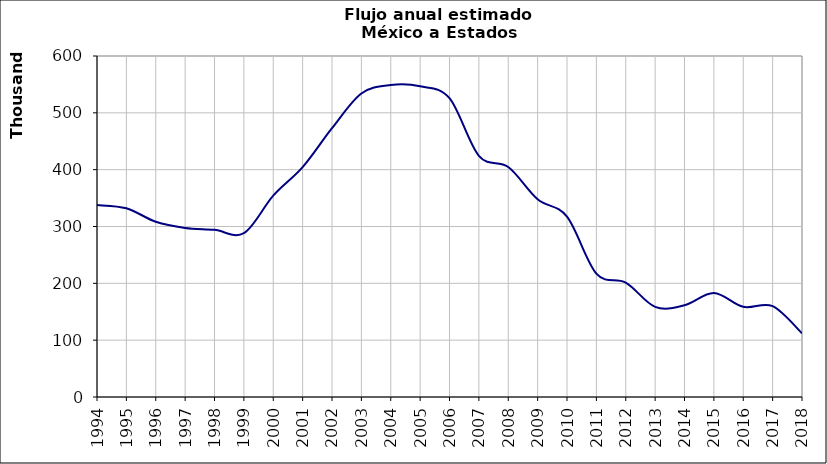
| Category | Flujo anual |
|---|---|
| 1994.0 | 337796.16 |
| 1995.0 | 332085.154 |
| 1996.0 | 308363.04 |
| 1997.0 | 297545.453 |
| 1998.0 | 294086.72 |
| 1999.0 | 288229.093 |
| 2000.0 | 354257.76 |
| 2001.0 | 404343.886 |
| 2002.0 | 472895.686 |
| 2003.0 | 534095.429 |
| 2004.0 | 548921.44 |
| 2005.0 | 546659.394 |
| 2006.0 | 525788.352 |
| 2007.0 | 424291.716 |
| 2008.0 | 404718.752 |
| 2009.0 | 348062.857 |
| 2010.0 | 317214.72 |
| 2011.0 | 217015.429 |
| 2012.0 | 201173.92 |
| 2013.0 | 158592.19 |
| 2014.0 | 161378.72 |
| 2015.0 | 182915.048 |
| 2016.0 | 158649.92 |
| 2017.0 | 159746.857 |
| 2018.0 | 112073.6 |